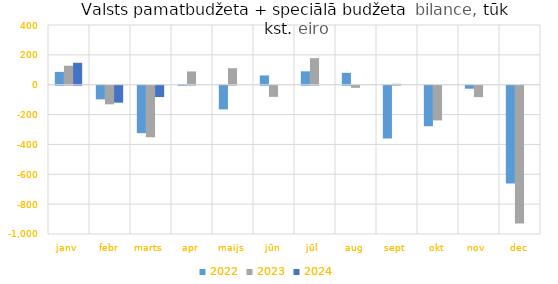
| Category | 2022 | 2023 | 2024 |
|---|---|---|---|
| janv | 85977.566 | 127204.091 | 146817.044 |
| febr | -91449.582 | -124563.375 | -113614.856 |
| marts | -317726.304 | -345186.23 | -76031.036 |
| apr | 4462.198 | 88892.873 | 0 |
| maijs | -158594.854 | 110598.178 | 0 |
| jūn | 62199.471 | -74676.403 | 0 |
| jūl | 89874.872 | 178052.175 | 0 |
| aug | 79584.039 | -14215.982 | 0 |
| sept | -353345.335 | 6441.615 | 0 |
| okt | -271420.986 | -232336.483 | 0 |
| nov | -20014.95 | -76225.649 | 0 |
| dec | -655267.986 | -923572.73 | 0 |